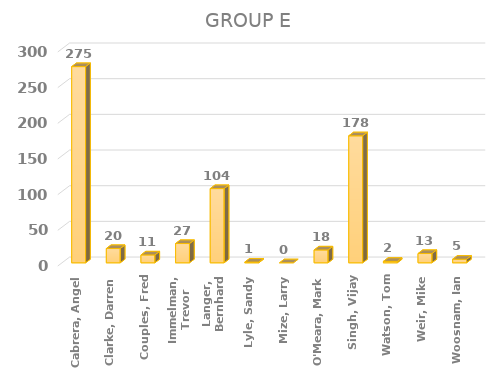
| Category | Series 0 |
|---|---|
| Cabrera, Angel | 275 |
| Clarke, Darren | 20 |
| Couples, Fred | 11 |
| Immelman, Trevor | 27 |
| Langer, Bernhard | 104 |
| Lyle, Sandy | 1 |
| Mize, Larry | 0 |
| O'Meara, Mark | 18 |
| Singh, Vijay | 178 |
| Watson, Tom | 2 |
| Weir, Mike | 13 |
| Woosnam, Ian | 5 |